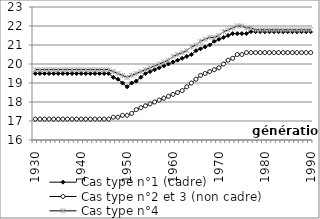
| Category | Cas type n°1 (cadre) | Cas type n°2 et 3 (non cadre) | Cas type n°4  |
|---|---|---|---|
| 1930.0 | 19.5 | 17.1 | 19.7 |
| 1931.0 | 19.5 | 17.1 | 19.7 |
| 1932.0 | 19.5 | 17.1 | 19.7 |
| 1933.0 | 19.5 | 17.1 | 19.7 |
| 1934.0 | 19.5 | 17.1 | 19.7 |
| 1935.0 | 19.5 | 17.1 | 19.7 |
| 1936.0 | 19.5 | 17.1 | 19.7 |
| 1937.0 | 19.5 | 17.1 | 19.7 |
| 1938.0 | 19.5 | 17.1 | 19.7 |
| 1939.0 | 19.5 | 17.1 | 19.7 |
| 1940.0 | 19.5 | 17.1 | 19.7 |
| 1941.0 | 19.5 | 17.1 | 19.7 |
| 1942.0 | 19.5 | 17.1 | 19.7 |
| 1943.0 | 19.5 | 17.1 | 19.7 |
| 1944.0 | 19.5 | 17.1 | 19.7 |
| 1945.0 | 19.5 | 17.1 | 19.7 |
| 1946.0 | 19.5 | 17.1 | 19.7 |
| 1947.0 | 19.3 | 17.2 | 19.6 |
| 1948.0 | 19.2 | 17.2 | 19.5 |
| 1949.0 | 19 | 17.3 | 19.4 |
| 1950.0 | 18.8 | 17.3 | 19.3 |
| 1951.0 | 19 | 17.4 | 19.4 |
| 1952.0 | 19.1 | 17.6 | 19.5 |
| 1953.0 | 19.3 | 17.7 | 19.6 |
| 1954.0 | 19.5 | 17.8 | 19.7 |
| 1955.0 | 19.6 | 17.9 | 19.8 |
| 1956.0 | 19.7 | 18 | 19.9 |
| 1957.0 | 19.8 | 18.1 | 20 |
| 1958.0 | 19.9 | 18.2 | 20.1 |
| 1959.0 | 20 | 18.3 | 20.2 |
| 1960.0 | 20.1 | 18.4 | 20.4 |
| 1961.0 | 20.2 | 18.5 | 20.5 |
| 1962.0 | 20.3 | 18.6 | 20.6 |
| 1963.0 | 20.4 | 18.8 | 20.7 |
| 1964.0 | 20.5 | 19 | 20.9 |
| 1965.0 | 20.7 | 19.2 | 21 |
| 1966.0 | 20.8 | 19.4 | 21.2 |
| 1967.0 | 20.9 | 19.5 | 21.3 |
| 1968.0 | 21 | 19.6 | 21.4 |
| 1969.0 | 21.2 | 19.7 | 21.4 |
| 1970.0 | 21.3 | 19.8 | 21.5 |
| 1971.0 | 21.4 | 20 | 21.7 |
| 1972.0 | 21.5 | 20.2 | 21.8 |
| 1973.0 | 21.6 | 20.3 | 21.9 |
| 1974.0 | 21.6 | 20.5 | 22 |
| 1975.0 | 21.6 | 20.5 | 22 |
| 1976.0 | 21.6 | 20.6 | 21.9 |
| 1977.0 | 21.7 | 20.6 | 21.9 |
| 1978.0 | 21.7 | 20.6 | 21.8 |
| 1979.0 | 21.7 | 20.6 | 21.8 |
| 1980.0 | 21.7 | 20.6 | 21.8 |
| 1981.0 | 21.7 | 20.6 | 21.8 |
| 1982.0 | 21.7 | 20.6 | 21.8 |
| 1983.0 | 21.7 | 20.6 | 21.8 |
| 1984.0 | 21.7 | 20.6 | 21.8 |
| 1985.0 | 21.7 | 20.6 | 21.8 |
| 1986.0 | 21.7 | 20.6 | 21.8 |
| 1987.0 | 21.7 | 20.6 | 21.8 |
| 1988.0 | 21.7 | 20.6 | 21.8 |
| 1989.0 | 21.7 | 20.6 | 21.8 |
| 1990.0 | 21.7 | 20.6 | 21.8 |